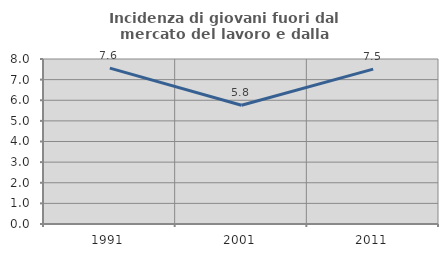
| Category | Incidenza di giovani fuori dal mercato del lavoro e dalla formazione  |
|---|---|
| 1991.0 | 7.56 |
| 2001.0 | 5.757 |
| 2011.0 | 7.51 |